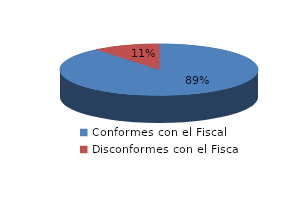
| Category | Series 0 |
|---|---|
| 0 | 428 |
| 1 | 52 |